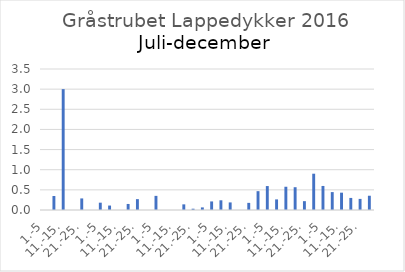
| Category | Series 0 |
|---|---|
| 1.-5 | 0 |
| 6.-10. | 0.347 |
| 11.-15. | 3 |
| 16.-20. | 0 |
| 21.-25. | 0.287 |
| 26.-31. | 0 |
| 1.-5 | 0.182 |
| 6.-10. | 0.11 |
| 11.-15. | 0 |
| 16.-20. | 0.15 |
| 21.-25. | 0.27 |
| 26.-31. | 0 |
| 1.-5 | 0.351 |
| 6.-10. | 0 |
| 11.-15. | 0 |
| 16.-20. | 0.14 |
| 21.-25. | 0.032 |
| 26.-30. | 0.065 |
| 1.-5 | 0.213 |
| 6.-10. | 0.241 |
| 11.-15. | 0.188 |
| 16.-20. | 0 |
| 21.-25. | 0.177 |
| 26.-31. | 0.468 |
| 1.-5 | 0.594 |
| 6.-10. | 0.263 |
| 11.-15. | 0.577 |
| 16.-20. | 0.566 |
| 21.-25. | 0.22 |
| 26.-30. | 0.901 |
| 1.-5 | 0.597 |
| 6.-10. | 0.444 |
| 11.-15. | 0.43 |
| 16.-20. | 0.3 |
| 21.-25. | 0.275 |
| 26.-31. | 0.354 |